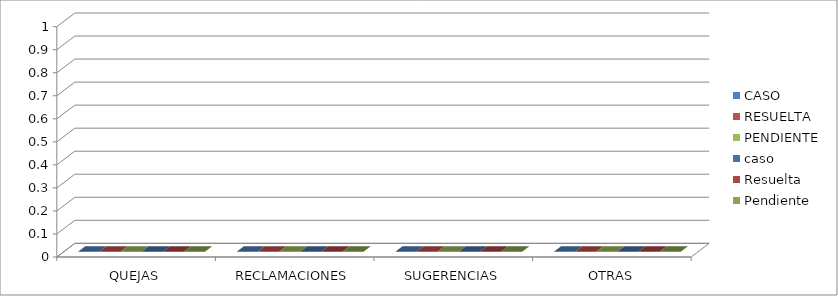
| Category | CASO | RESUELTA | PENDIENTE | caso  | Resuelta  | Pendiente |
|---|---|---|---|---|---|---|
| QUEJAS | 0 | 0 | 0 | 0 | 0 | 0 |
| RECLAMACIONES | 0 | 0 | 0 | 0 | 0 | 0 |
| SUGERENCIAS | 0 | 0 | 0 | 0 | 0 | 0 |
| OTRAS | 0 | 0 | 0 | 0 | 0 | 0 |